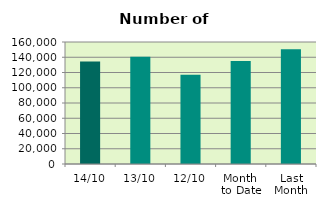
| Category | Series 0 |
|---|---|
| 14/10 | 134322 |
| 13/10 | 140612 |
| 12/10 | 116986 |
| Month 
to Date | 134968.2 |
| Last
Month | 150562.364 |